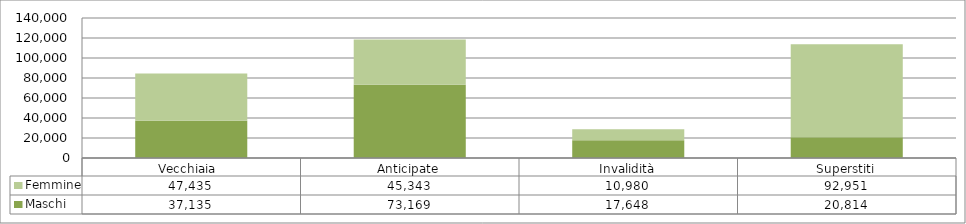
| Category | Maschi | Femmine |
|---|---|---|
| Vecchiaia  | 37135 | 47435 |
| Anticipate | 73169 | 45343 |
| Invalidità | 17648 | 10980 |
| Superstiti | 20814 | 92951 |